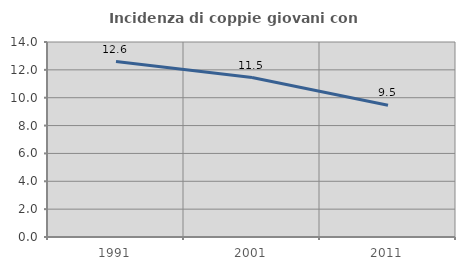
| Category | Incidenza di coppie giovani con figli |
|---|---|
| 1991.0 | 12.593 |
| 2001.0 | 11.451 |
| 2011.0 | 9.463 |